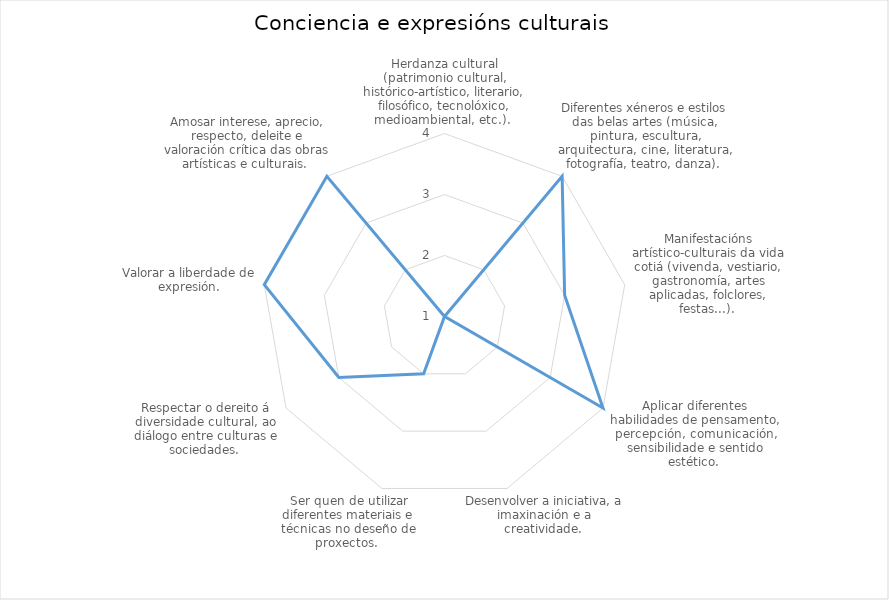
| Category | Series 0 |
|---|---|
| Herdanza cultural (patrimonio cultural, histórico-artístico, literario, filosófico, tecnolóxico, medioambiental, etc.).  | 1 |
| Diferentes xéneros e estilos das belas artes (música, pintura, escultura, arquitectura, cine, literatura, fotografía, teatro, danza).  | 4 |
| Manifestacións artístico-culturais da vida cotiá (vivenda, vestiario, gastronomía, artes aplicadas, folclores, festas...).  | 3 |
| Aplicar diferentes habilidades de pensamento, percepción, comunicación, sensibilidade e sentido estético.  | 4 |
| Desenvolver a iniciativa, a imaxinación e a creatividade.  | 1 |
| Ser quen de utilizar diferentes materiais e técnicas no deseño de proxectos.  | 2 |
| Respectar o dereito á diversidade cultural, ao diálogo entre culturas e sociedades.  | 3 |
| Valorar a liberdade de expresión. | 4 |
| Amosar interese, aprecio, respecto, deleite e valoración crítica das obras artísticas e culturais.  | 4 |